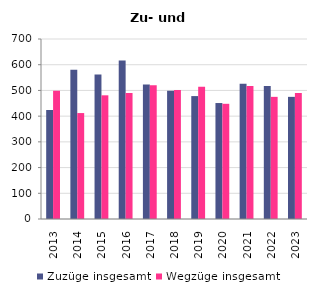
| Category | Zuzüge insgesamt | Wegzüge insgesamt |
|---|---|---|
| 2013.0 | 424 | 499 |
| 2014.0 | 580 | 412 |
| 2015.0 | 562 | 481 |
| 2016.0 | 616 | 490 |
| 2017.0 | 523 | 520 |
| 2018.0 | 499 | 502 |
| 2019.0 | 478 | 514 |
| 2020.0 | 451 | 448 |
| 2021.0 | 526 | 517 |
| 2022.0 | 517 | 475 |
| 2023.0 | 475 | 490 |